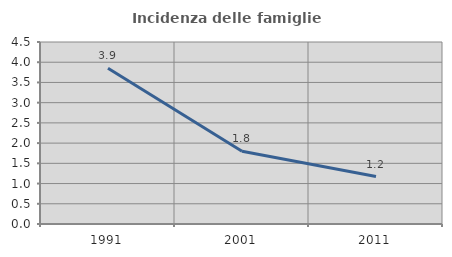
| Category | Incidenza delle famiglie numerose |
|---|---|
| 1991.0 | 3.853 |
| 2001.0 | 1.801 |
| 2011.0 | 1.174 |